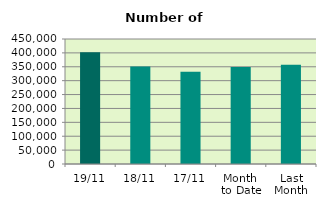
| Category | Series 0 |
|---|---|
| 19/11 | 402278 |
| 18/11 | 350572 |
| 17/11 | 331652 |
| Month 
to Date | 349378.667 |
| Last
Month | 357160.667 |